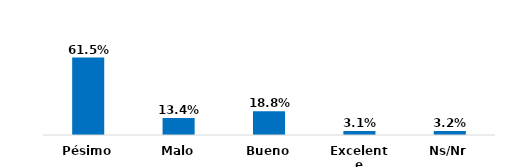
| Category | Series 0 |
|---|---|
| Pésimo | 0.615 |
| Malo | 0.134 |
| Bueno | 0.188 |
| Excelente | 0.031 |
| Ns/Nr | 0.032 |